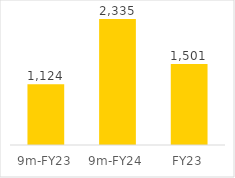
| Category | Series 0 |
|---|---|
| 9m-FY23 | 1123.847 |
| 9m-FY24 | 2335.038 |
| FY23 | 1501.002 |